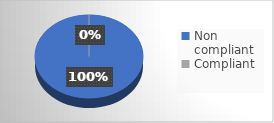
| Category | Series 0 |
|---|---|
| Non compliant | 5 |
| Compliant | 0 |